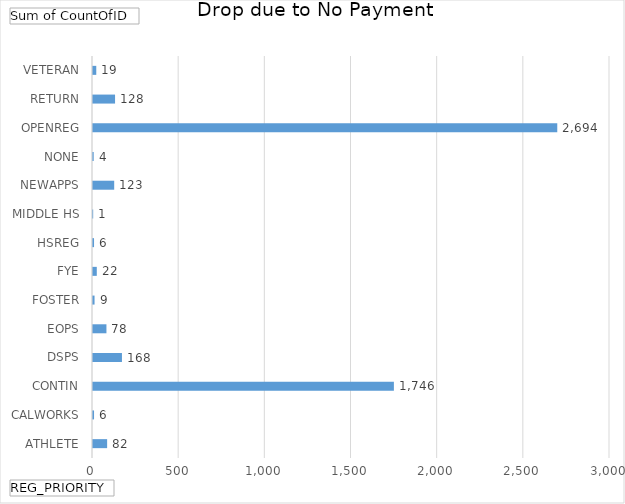
| Category | Total |
|---|---|
| ATHLETE | 82 |
| CALWORKS | 6 |
| CONTIN | 1746 |
| DSPS | 168 |
| EOPS | 78 |
| FOSTER | 9 |
| FYE | 22 |
| HSREG | 6 |
| MIDDLE HS | 1 |
| NEWAPPS | 123 |
| NONE | 4 |
| OPENREG | 2694 |
| RETURN | 128 |
| VETERAN | 19 |